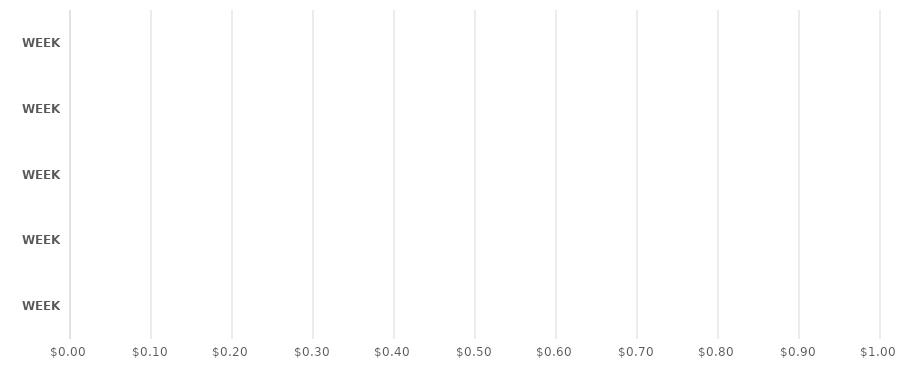
| Category | Series 0 |
|---|---|
| WEEK 1 | 0 |
| WEEK 2 | 0 |
| WEEK 3 | 0 |
| WEEK 4 | 0 |
| WEEK 5 | 0 |